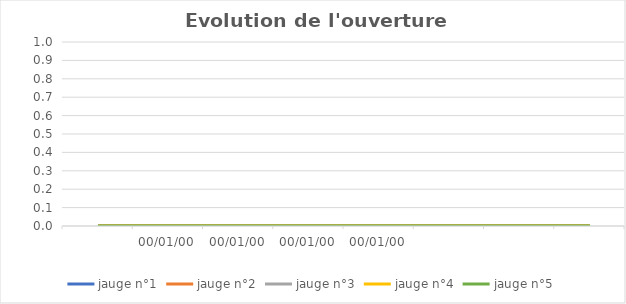
| Category | jauge n°1 | jauge n°2 | jauge n°3 | jauge n°4 | jauge n°5 |
|---|---|---|---|---|---|
|  | 0 | 0 | 0 | 0 | 0 |
| 00/01/00 | 0 | 0 | 0 | 0 | 0 |
| 00/01/00 | 0 | 0 | 0 | 0 | 0 |
| 00/01/00 | 0 | 0 | 0 | 0 | 0 |
| 00/01/00 | 0 | 0 | 0 | 0 | 0 |